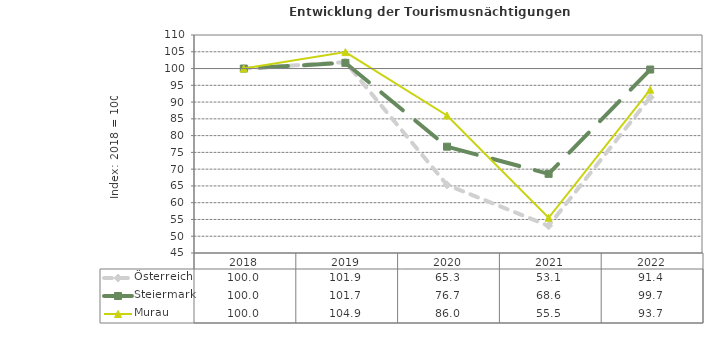
| Category | Österreich | Steiermark | Murau |
|---|---|---|---|
| 2022.0 | 91.4 | 99.7 | 93.7 |
| 2021.0 | 53.1 | 68.6 | 55.5 |
| 2020.0 | 65.3 | 76.7 | 86 |
| 2019.0 | 101.9 | 101.7 | 104.9 |
| 2018.0 | 100 | 100 | 100 |